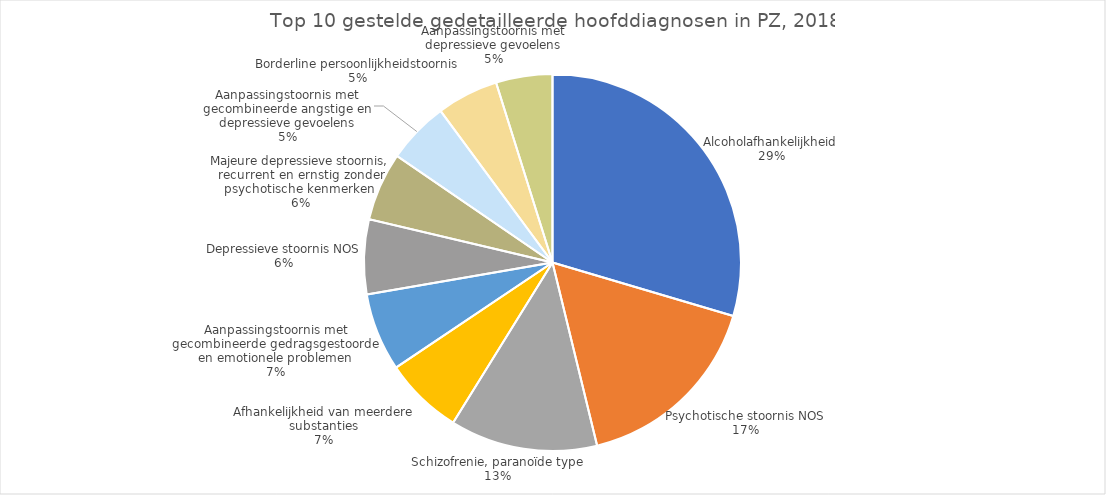
| Category | Aantal verblijven |
|---|---|
| Alcoholafhankelijkheid | 7502 |
| Psychotische stoornis NOS | 4215 |
| Schizofrenie, paranoïde type | 3207 |
| Afhankelijkheid van meerdere substanties | 1711 |
| Aanpassingstoornis met gecombineerde gedragsgestoorde en emotionele problemen | 1700 |
| Depressieve stoornis NOS | 1625 |
| Majeure depressieve stoornis, recurrent en ernstig zonder psychotische kenmerken  | 1487 |
| Aanpassingstoornis met gecombineerde angstige en depressieve gevoelens | 1350 |
| Borderline persoonlijkheidstoornis | 1340 |
| Aanpassingstoornis met depressieve gevoelens | 1227 |